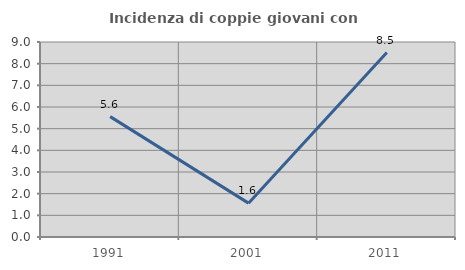
| Category | Incidenza di coppie giovani con figli |
|---|---|
| 1991.0 | 5.556 |
| 2001.0 | 1.562 |
| 2011.0 | 8.511 |